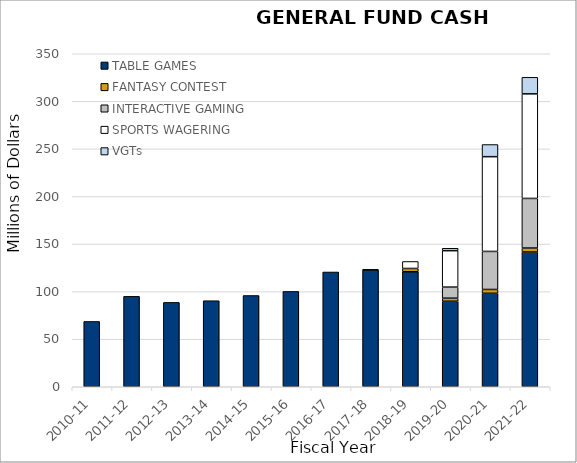
| Category | TABLE GAMES | FANTASY CONTEST | INTERACTIVE GAMING | SPORTS WAGERING | VGTs |
|---|---|---|---|---|---|
| 2010-11 | 68.663 | 0 | 0 | 0 | 0 |
| 2011-12 | 95.029 | 0 | 0 | 0 | 0 |
| 2012-13 | 88.679 | 0 | 0 | 0 | 0 |
| 2013-14 | 90.451 | 0 | 0 | 0 | 0 |
| 2014-15 | 95.921 | 0 | 0 | 0 | 0 |
| 2015-16 | 100.2 | 0 | 0 | 0 | 0 |
| 2016-17 | 120.611 | 0 | 0 | 0 | 0 |
| 2017-18 | 122.859 | 0.2 | 0 | 0 | 0 |
| 2018-19 | 120.874 | 3.452 | 0 | 7.347 | 0 |
| 2019-20 | 89.869 | 3.228 | 11.646 | 38.279 | 2.523 |
| 2020-21 | 98.254 | 4.003 | 39.976 | 99.601 | 12.76 |
| 2021-22 | 141.634 | 4.15 | 52.158 | 109.915 | 17.393 |